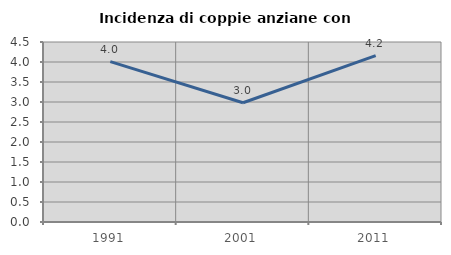
| Category | Incidenza di coppie anziane con figli |
|---|---|
| 1991.0 | 4.008 |
| 2001.0 | 2.98 |
| 2011.0 | 4.158 |